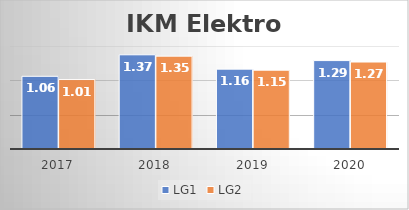
| Category | LG1 | LG2 |
|---|---|---|
| 2017.0 | 1.059 | 1.011 |
| 2018.0 | 1.372 | 1.352 |
| 2019.0 | 1.163 | 1.148 |
| 2020.0 | 1.288 | 1.267 |